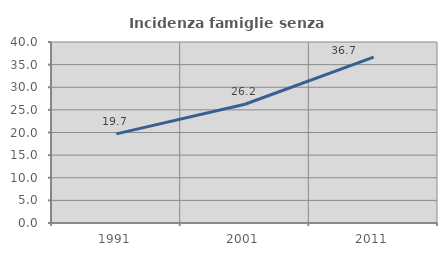
| Category | Incidenza famiglie senza nuclei |
|---|---|
| 1991.0 | 19.688 |
| 2001.0 | 26.248 |
| 2011.0 | 36.674 |